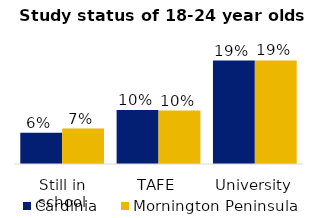
| Category | Cardinia | Mornington Peninsula |
|---|---|---|
| Still in school | 0.059 | 0.067 |
| TAFE | 0.102 | 0.1 |
| University | 0.194 | 0.195 |